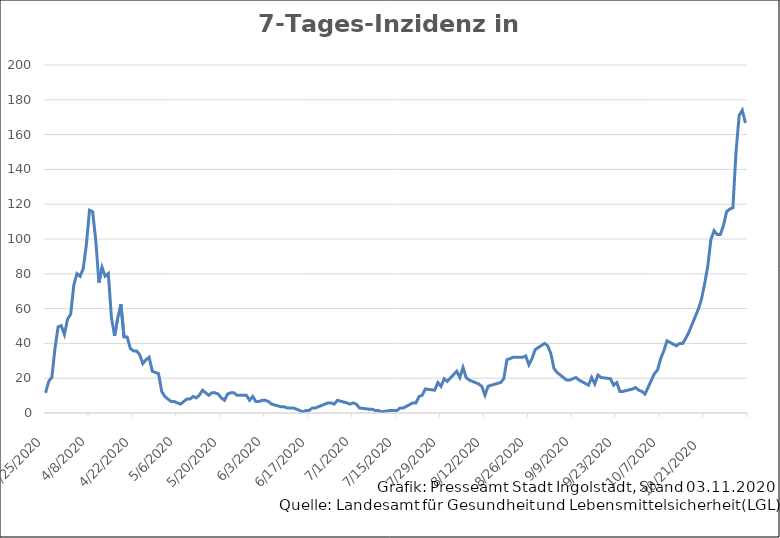
| Category | Inzidenz |
|---|---|
| 3/25/20 | 11.6 |
| 3/26/20 | 18.2 |
| 3/27/20 | 20.4 |
| 3/28/20 | 37.1 |
| 3/29/20 | 49.5 |
| 3/30/20 | 50.2 |
| 3/31/20 | 45.1 |
| 4/1/20 | 53.9 |
| 4/2/20 | 56.8 |
| 4/3/20 | 73.5 |
| 4/4/20 | 80.1 |
| 4/5/20 | 78.6 |
| 4/6/20 | 83 |
| 4/7/20 | 96.8 |
| 4/8/20 | 116.5 |
| 4/9/20 | 115.7 |
| 4/10/20 | 99 |
| 4/11/20 | 75 |
| 4/12/20 | 83.7 |
| 4/13/20 | 78.6 |
| 4/14/20 | 80.1 |
| 4/15/20 | 54.6 |
| 4/16/20 | 44.4 |
| 4/17/20 | 54.6 |
| 4/18/20 | 62.6 |
| 4/19/20 | 43.7 |
| 4/20/20 | 43.7 |
| 4/21/20 | 37.1 |
| 4/22/20 | 35.7 |
| 4/23/20 | 35.7 |
| 4/24/20 | 33.5 |
| 4/25/20 | 28.4 |
| 4/26/20 | 30.6 |
| 4/27/20 | 32 |
| 4/28/20 | 24 |
| 4/29/20 | 23.3 |
| 4/30/20 | 22.6 |
| 5/1/20 | 12.4 |
| 5/2/20 | 9.5 |
| 5/3/20 | 8 |
| 5/4/20 | 6.6 |
| 5/5/20 | 6.6 |
| 5/6/20 | 5.8 |
| 5/7/20 | 5.1 |
| 5/8/20 | 6.6 |
| 5/9/20 | 8 |
| 5/10/20 | 8 |
| 5/11/20 | 9.5 |
| 5/12/20 | 8.7 |
| 5/13/20 | 10.2 |
| 5/14/20 | 13.1 |
| 5/15/20 | 11.6 |
| 5/16/20 | 10.2 |
| 5/17/20 | 11.6 |
| 5/18/20 | 11.6 |
| 5/19/20 | 10.9 |
| 5/20/20 | 8.7 |
| 5/21/20 | 7.3 |
| 5/22/20 | 10.9 |
| 5/23/20 | 11.6 |
| 5/24/20 | 11.6 |
| 5/25/20 | 10.2 |
| 5/26/20 | 10.2 |
| 5/27/20 | 10.2 |
| 5/28/20 | 10.2 |
| 5/29/20 | 7.3 |
| 5/30/20 | 9.5 |
| 5/31/20 | 6.6 |
| 6/1/20 | 6.6 |
| 6/2/20 | 7.3 |
| 6/3/20 | 7.3 |
| 6/4/20 | 6.6 |
| 6/5/20 | 5.1 |
| 6/8/20 | 3.6 |
| 6/9/20 | 3.6 |
| 6/10/20 | 2.9 |
| 6/12/20 | 2.9 |
| 6/15/20 | 0.7 |
| 6/16/20 | 1.5 |
| 6/17/20 | 1.5 |
| 6/18/20 | 2.9 |
| 6/19/20 | 2.9 |
| 6/22/20 | 5.1 |
| 6/23/20 | 5.8 |
| 6/24/20 | 5.8 |
| 6/25/20 | 5.1 |
| 6/26/20 | 7.3 |
| 6/29/20 | 5.8 |
| 6/30/20 | 5.1 |
| 7/1/20 | 5.8 |
| 7/2/20 | 5.1 |
| 7/3/20 | 2.9 |
| 7/6/20 | 2.2 |
| 7/7/20 | 2.2 |
| 7/8/20 | 1.5 |
| 7/9/20 | 1.5 |
| 7/10/20 | 0.7 |
| 7/13/20 | 1.5 |
| 7/14/20 | 1.5 |
| 7/15/20 | 1.5 |
| 7/16/20 | 2.9 |
| 7/17/20 | 2.9 |
| 7/20/20 | 5.8 |
| 7/21/20 | 5.8 |
| 7/22/20 | 9.5 |
| 7/23/20 | 10.2 |
| 7/24/20 | 13.8 |
| 7/27/20 | 13.1 |
| 7/28/20 | 17.5 |
| 7/29/20 | 15.3 |
| 7/30/20 | 19.7 |
| 7/31/20 | 18.2 |
| 8/3/20 | 24 |
| 8/4/20 | 20.4 |
| 8/5/20 | 26.2 |
| 8/6/20 | 20.4 |
| 8/7/20 | 18.9 |
| 8/10/20 | 16.7 |
| 8/11/20 | 15.3 |
| 8/12/20 | 10.2 |
| 8/13/20 | 15.3 |
| 8/14/20 | 16 |
| 8/17/20 | 17.5 |
| 8/18/20 | 19.7 |
| 8/19/20 | 30.6 |
| 8/20/20 | 31.3 |
| 8/21/20 | 32 |
| 8/24/20 | 32 |
| 8/25/20 | 32.8 |
| 8/26/20 | 27.7 |
| 8/27/20 | 31.3 |
| 8/28/20 | 36.4 |
| 8/31/20 | 40 |
| 9/1/20 | 38.6 |
| 9/2/20 | 34.2 |
| 9/3/20 | 25.5 |
| 9/4/20 | 23.3 |
| 9/7/20 | 18.9 |
| 9/8/20 | 18.9 |
| 9/9/20 | 19.7 |
| 9/10/20 | 20.4 |
| 9/11/20 | 18.9 |
| 9/14/20 | 16 |
| 9/15/20 | 20.4 |
| 9/16/20 | 16.7 |
| 9/17/20 | 21.8 |
| 9/18/20 | 20.4 |
| 9/21/20 | 19.7 |
| 9/22/20 | 16 |
| 9/23/20 | 17.5 |
| 9/24/20 | 12.4 |
| 9/25/20 | 12.4 |
| 9/28/20 | 13.8 |
| 9/29/20 | 14.6 |
| 9/30/20 | 13.1 |
| 10/1/20 | 12.4 |
| 10/2/20 | 10.9 |
| 10/5/20 | 22.6 |
| 10/6/20 | 24.7 |
| 10/7/20 | 31.3 |
| 10/8/20 | 35.7 |
| 10/9/20 | 41.5 |
| 10/12/20 | 38.6 |
| 10/13/20 | 40 |
| 10/14/20 | 40 |
| 10/15/20 | 42.9 |
| 10/16/20 | 46.6 |
| 10/19/20 | 59.7 |
| 10/20/20 | 65.5 |
| 10/21/20 | 74.2 |
| 10/22/20 | 84.4 |
| 10/23/20 | 99.7 |
| 10/24/20 | 104.8 |
| 10/25/20 | 102.6 |
| 10/26/20 | 102.6 |
| 10/27/20 | 107.7 |
| 10/28/20 | 115.7 |
| 10/29/20 | 117.2 |
| 10/30/20 | 117.9 |
| 10/31/20 | 149.9 |
| 11/1/20 | 171 |
| 11/2/20 | 174 |
| 11/3/20 | 166.7 |